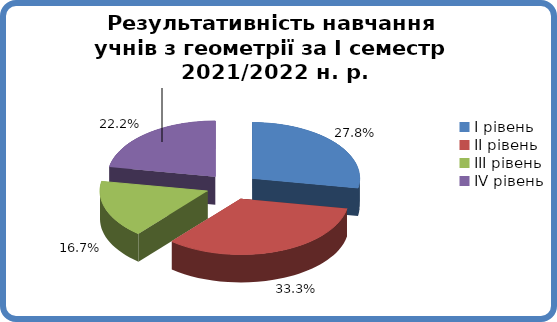
| Category | Series 0 |
|---|---|
| 0 | 0.278 |
| 1 | 0.333 |
| 2 | 0.167 |
| 3 | 0.222 |